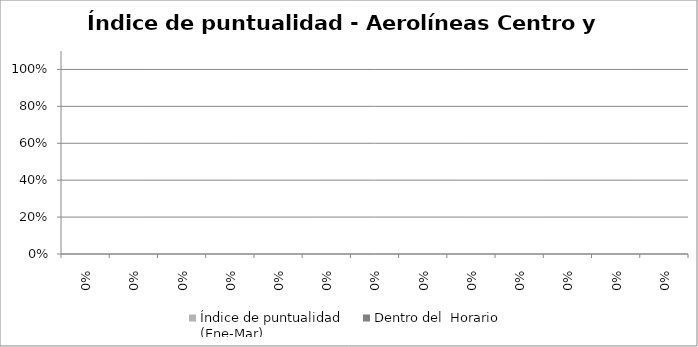
| Category | Índice de puntualidad
(Ene-Mar) | Dentro del  Horario |
|---|---|---|
| 0.0 | 0 | 0 |
| 0.0 | 0 | 0 |
| 0.0 | 0 | 0 |
| 0.0 | 0 | 0 |
| 0.0 | 0 | 0 |
| 0.0 | 0 | 0 |
| 0.0 | 0 | 0 |
| 0.0 | 0 | 0 |
| 0.0 | 0 | 0 |
| 0.0 | 0 | 0 |
| 0.0 | 0 | 0 |
| 0.0 | 0 | 0 |
| 0.0 | 0 | 0 |